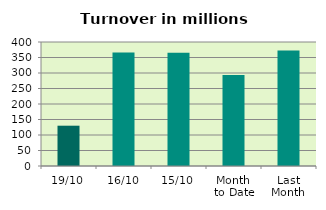
| Category | Series 0 |
|---|---|
| 19/10 | 129.995 |
| 16/10 | 366.453 |
| 15/10 | 365.056 |
| Month 
to Date | 293.916 |
| Last
Month | 372.713 |